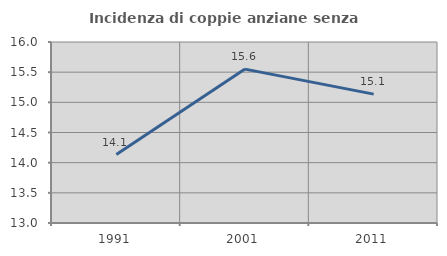
| Category | Incidenza di coppie anziane senza figli  |
|---|---|
| 1991.0 | 14.134 |
| 2001.0 | 15.551 |
| 2011.0 | 15.136 |